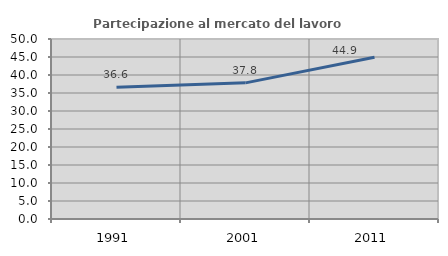
| Category | Partecipazione al mercato del lavoro  femminile |
|---|---|
| 1991.0 | 36.594 |
| 2001.0 | 37.818 |
| 2011.0 | 44.928 |